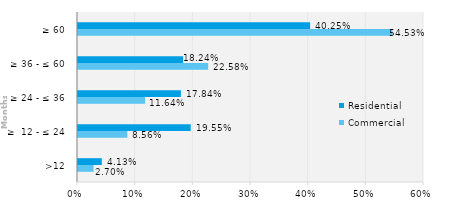
| Category | Commercial | Residential |
|---|---|---|
| >12 | 0.027 | 0.041 |
| ≥  12 - ≤ 24 | 0.086 | 0.195 |
| ≥ 24 - ≤ 36 | 0.116 | 0.178 |
| ≥ 36 - ≤ 60 | 0.226 | 0.182 |
| ≥ 60 | 0.545 | 0.402 |